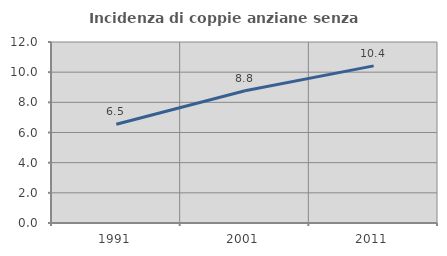
| Category | Incidenza di coppie anziane senza figli  |
|---|---|
| 1991.0 | 6.546 |
| 2001.0 | 8.764 |
| 2011.0 | 10.416 |